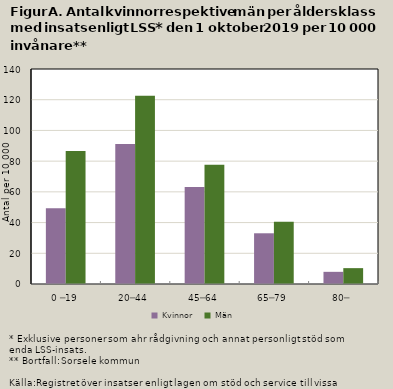
| Category | Kvinnor | Män |
|---|---|---|
| 0 ─19 | 49.33 | 86.682 |
| 20─44 | 91.115 | 122.505 |
| 45─64 | 63.182 | 77.61 |
| 65─79 | 33.025 | 40.56 |
| 80─ | 7.923 | 10.326 |